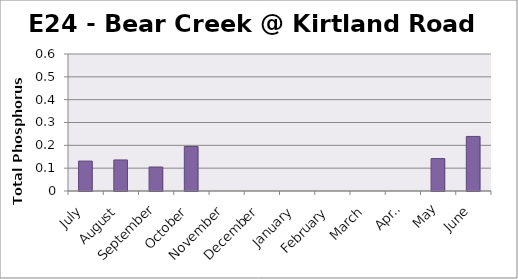
| Category | Phosphorus (mg/L) |
|---|---|
| July | 0.131 |
| August | 0.136 |
| September | 0.105 |
| October | 0.195 |
| November | 0 |
| December | 0 |
| January | 0 |
| February | 0 |
| March | 0 |
| April | 0 |
| May | 0.142 |
| June | 0.239 |